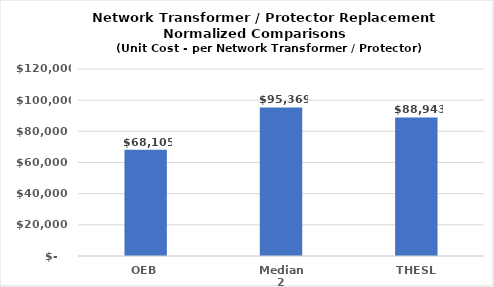
| Category | Series 0 |
|---|---|
| OEB | 68105 |
| Median 2 | 95369.271 |
| THESL | 88943 |